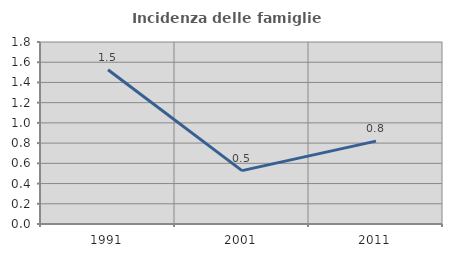
| Category | Incidenza delle famiglie numerose |
|---|---|
| 1991.0 | 1.525 |
| 2001.0 | 0.528 |
| 2011.0 | 0.82 |